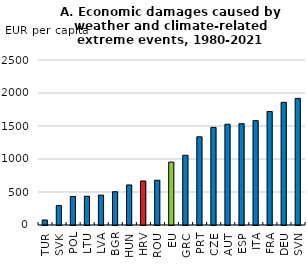
| Category | Losses per capita (EURO) |
|---|---|
| TUR | 76 |
| SVK | 294 |
| POL | 432 |
| LTU | 436 |
| LVA | 453 |
| BGR | 504 |
| HUN | 607 |
| HRV | 667 |
| ROU | 678 |
| EU | 953.37 |
| GRC | 1057 |
| PRT | 1336 |
| CZE | 1479 |
| AUT | 1527 |
| ESP | 1535 |
| ITA | 1581 |
| FRA | 1720 |
| DEU | 1859 |
| SVN | 1918 |